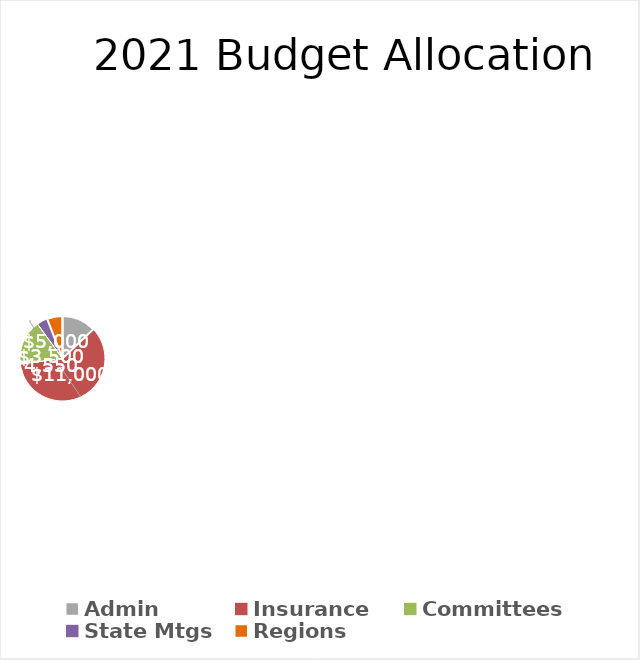
| Category | Series 0 |
|---|---|
| Admin | 11000 |
| Insurance  | 51000 |
| Committees | 14550 |
| State Mtgs | 3500 |
| Regions | 5000 |